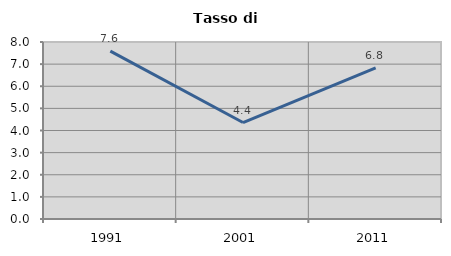
| Category | Tasso di disoccupazione   |
|---|---|
| 1991.0 | 7.588 |
| 2001.0 | 4.361 |
| 2011.0 | 6.834 |